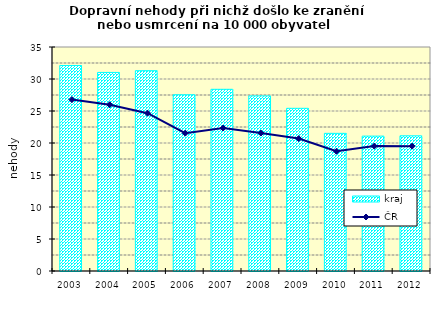
| Category | kraj |
|---|---|
| 2003.0 | 32.111 |
| 2004.0 | 31.026 |
| 2005.0 | 31.301 |
| 2006.0 | 27.534 |
| 2007.0 | 28.39 |
| 2008.0 | 27.359 |
| 2009.0 | 25.418 |
| 2010.0 | 21.508 |
| 2011.0 | 21.075 |
| 2012.0 | 21.121 |